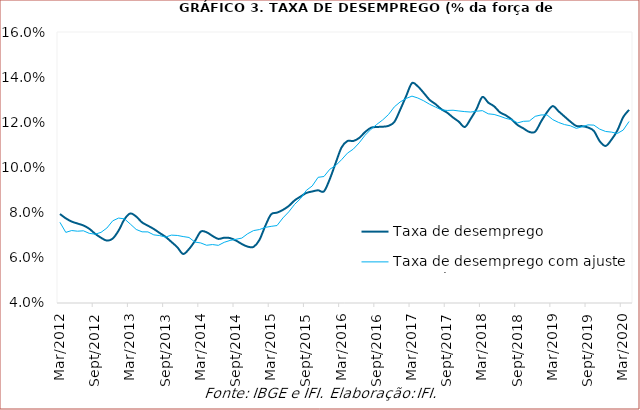
| Category | Taxa de desemprego | Taxa de desemprego com ajuste sazonal |
|---|---|---|
| 2012-03-01 | 0.079 | 0.076 |
| 2012-04-01 | 0.077 | 0.071 |
| 2012-05-01 | 0.076 | 0.072 |
| 2012-06-01 | 0.075 | 0.072 |
| 2012-07-01 | 0.074 | 0.072 |
| 2012-08-01 | 0.073 | 0.071 |
| 2012-09-01 | 0.071 | 0.07 |
| 2012-10-01 | 0.069 | 0.071 |
| 2012-11-01 | 0.068 | 0.073 |
| 2012-12-01 | 0.069 | 0.076 |
| 2013-01-01 | 0.072 | 0.078 |
| 2013-02-01 | 0.077 | 0.077 |
| 2013-03-01 | 0.08 | 0.075 |
| 2013-04-01 | 0.078 | 0.073 |
| 2013-05-01 | 0.076 | 0.072 |
| 2013-06-01 | 0.074 | 0.071 |
| 2013-07-01 | 0.073 | 0.07 |
| 2013-08-01 | 0.071 | 0.07 |
| 2013-09-01 | 0.069 | 0.069 |
| 2013-10-01 | 0.067 | 0.07 |
| 2013-11-01 | 0.065 | 0.07 |
| 2013-12-01 | 0.062 | 0.069 |
| 2014-01-01 | 0.064 | 0.069 |
| 2014-02-01 | 0.067 | 0.067 |
| 2014-03-01 | 0.072 | 0.067 |
| 2014-04-01 | 0.071 | 0.066 |
| 2014-05-01 | 0.07 | 0.066 |
| 2014-06-01 | 0.068 | 0.066 |
| 2014-07-01 | 0.069 | 0.067 |
| 2014-08-01 | 0.069 | 0.068 |
| 2014-09-01 | 0.068 | 0.068 |
| 2014-10-01 | 0.066 | 0.069 |
| 2014-11-01 | 0.065 | 0.071 |
| 2014-12-01 | 0.065 | 0.072 |
| 2015-01-01 | 0.068 | 0.073 |
| 2015-02-01 | 0.074 | 0.073 |
| 2015-03-01 | 0.079 | 0.074 |
| 2015-04-01 | 0.08 | 0.074 |
| 2015-05-01 | 0.081 | 0.078 |
| 2015-06-01 | 0.083 | 0.08 |
| 2015-07-01 | 0.085 | 0.084 |
| 2015-08-01 | 0.087 | 0.086 |
| 2015-09-01 | 0.089 | 0.09 |
| 2015-10-01 | 0.089 | 0.092 |
| 2015-11-01 | 0.09 | 0.096 |
| 2015-12-01 | 0.089 | 0.096 |
| 2016-01-01 | 0.095 | 0.099 |
| 2016-02-01 | 0.102 | 0.101 |
| 2016-03-01 | 0.109 | 0.103 |
| 2016-04-01 | 0.112 | 0.106 |
| 2016-05-01 | 0.112 | 0.108 |
| 2016-06-01 | 0.113 | 0.111 |
| 2016-07-01 | 0.116 | 0.114 |
| 2016-08-01 | 0.118 | 0.117 |
| 2016-09-01 | 0.118 | 0.119 |
| 2016-10-01 | 0.118 | 0.121 |
| 2016-11-01 | 0.118 | 0.123 |
| 2016-12-01 | 0.12 | 0.127 |
| 2017-01-01 | 0.126 | 0.129 |
| 2017-02-01 | 0.132 | 0.131 |
| 2017-03-01 | 0.137 | 0.132 |
| 2017-04-01 | 0.136 | 0.131 |
| 2017-05-01 | 0.133 | 0.13 |
| 2017-06-01 | 0.13 | 0.128 |
| 2017-07-01 | 0.128 | 0.127 |
| 2017-08-01 | 0.126 | 0.126 |
| 2017-09-01 | 0.124 | 0.125 |
| 2017-10-01 | 0.122 | 0.125 |
| 2017-11-01 | 0.12 | 0.125 |
| 2017-12-01 | 0.118 | 0.125 |
| 2018-01-01 | 0.122 | 0.125 |
| 2018-02-01 | 0.126 | 0.125 |
| 2018-03-01 | 0.131 | 0.125 |
| 2018-04-01 | 0.129 | 0.124 |
| 2018-05-01 | 0.127 | 0.123 |
| 2018-06-01 | 0.124 | 0.123 |
| 2018-07-01 | 0.123 | 0.122 |
| 2018-08-01 | 0.121 | 0.121 |
| 2018-09-01 | 0.119 | 0.12 |
| 2018-10-01 | 0.117 | 0.12 |
| 2018-11-01 | 0.116 | 0.121 |
| 2018-12-01 | 0.116 | 0.123 |
| 2019-01-01 | 0.12 | 0.123 |
| 2019-02-01 | 0.124 | 0.123 |
| 2019-03-01 | 0.127 | 0.121 |
| 2019-04-01 | 0.125 | 0.12 |
| 2019-05-01 | 0.123 | 0.119 |
| 2019-06-01 | 0.12 | 0.118 |
| 2019-07-01 | 0.118 | 0.117 |
| 2019-08-01 | 0.118 | 0.118 |
| 2019-09-01 | 0.118 | 0.119 |
| 2019-10-01 | 0.116 | 0.119 |
| 2019-11-01 | 0.112 | 0.117 |
| 2019-12-01 | 0.11 | 0.116 |
| 2020-01-01 | 0.112 | 0.116 |
| 2020-02-01 | 0.116 | 0.115 |
| 2020-03-01 | 0.122 | 0.117 |
| 2020-04-01 | 0.126 | 0.12 |